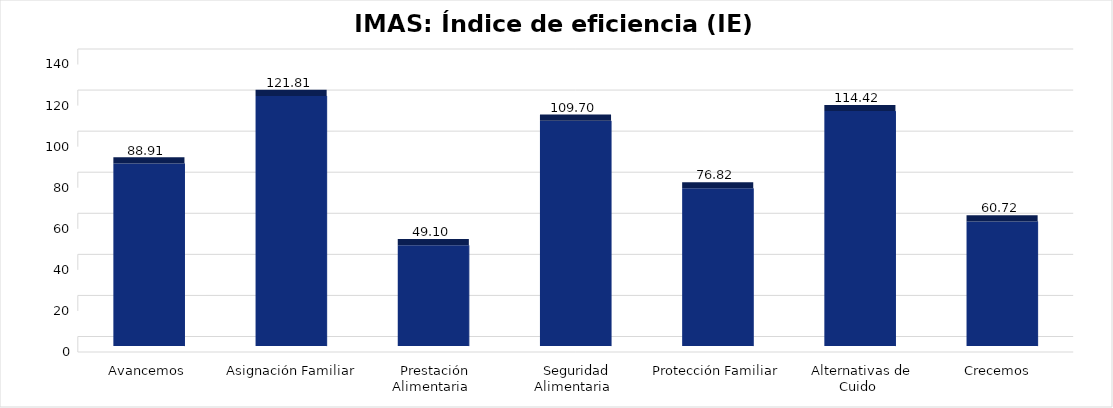
| Category | Índice de eficiencia (IE)  |
|---|---|
| Avancemos | 88.907 |
| Asignación Familiar | 121.81 |
| Prestación Alimentaria | 49.095 |
| Seguridad Alimentaria | 109.699 |
| Protección Familiar  | 76.816 |
| Alternativas de Cuido | 114.419 |
| Crecemos  | 60.719 |